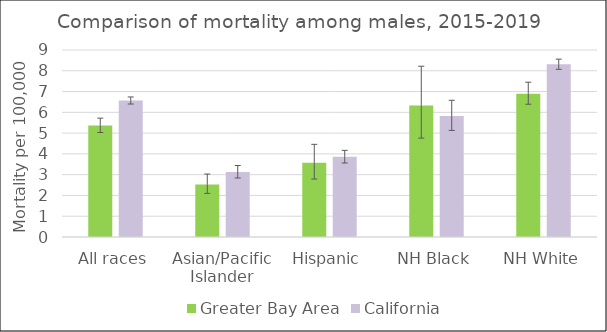
| Category | Greater Bay Area | California | US Mortality |
|---|---|---|---|
| All races | 5.37 | 6.57 |  |
| Asian/Pacific Islander | 2.53 | 3.13 |  |
| Hispanic | 3.57 | 3.86 |  |
| NH Black | 6.33 | 5.82 |  |
| NH White | 6.9 | 8.31 |  |